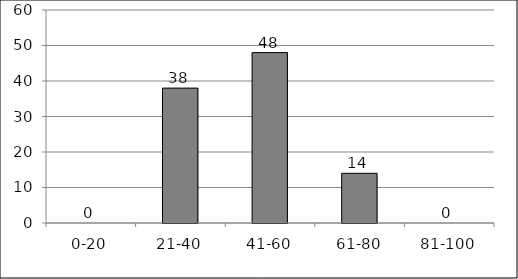
| Category | Series 0 |
|---|---|
| 0-20 | 0 |
| 21-40 | 38 |
| 41-60 | 48 |
| 61-80 | 14 |
| 81-100 | 0 |